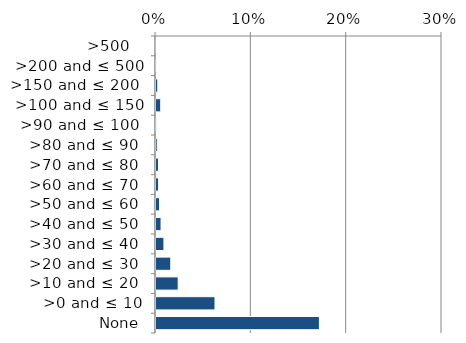
| Category | Native |
|---|---|
|  None | 0.172 |
| >0 and ≤ 10 | 0.063 |
| >10 and ≤ 20  | 0.024 |
| >20 and ≤ 30  | 0.017 |
| >30 and ≤ 40  | 0.009 |
| >40 and ≤ 50  | 0.006 |
| >50 and ≤ 60  | 0.005 |
| >60 and ≤ 70  | 0.004 |
| >70 and ≤ 80  | 0.004 |
| >80 and ≤ 90  | 0.002 |
| >90 and ≤ 100  | 0.002 |
| >100 and ≤ 150 | 0.006 |
| >150 and ≤ 200  | 0.003 |
| >200 and ≤ 500 | 0.002 |
| >500   | 0 |